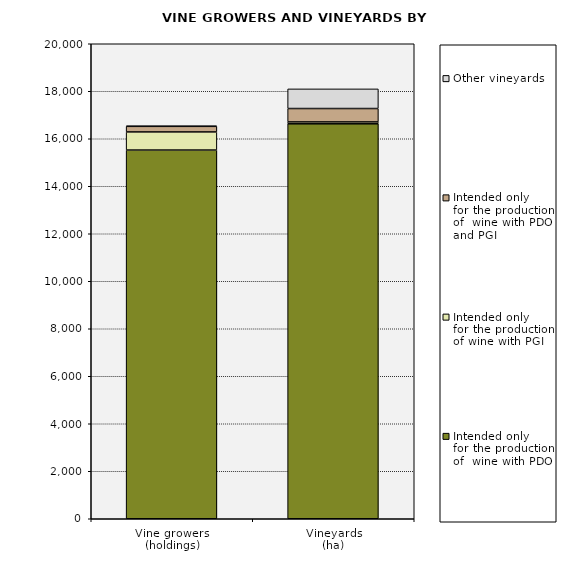
| Category | Intended only 
for the production 
of  wine with PDO | Intended only 
for the production 
of wine with PGI  | Intended only 
for the production 
of  wine with PDO and PGI | Other vineyards |
|---|---|---|---|---|
| Vine growers 
(holdings) | 15525 | 762 | 236 | 18 |
| Vineyards
(ha) | 16630.04 | 78.214 | 564.238 | 826.873 |